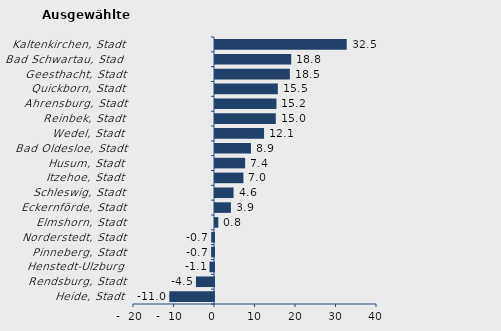
| Category | Wanderungssaldo |
|---|---|
| Heide, Stadt | -11.031 |
| Rendsburg, Stadt | -4.459 |
| Henstedt-Ulzburg | -1.107 |
| Pinneberg, Stadt | -0.713 |
| Norderstedt, Stadt | -0.695 |
| Elmshorn, Stadt | 0.821 |
| Eckernförde, Stadt | 3.928 |
| Schleswig, Stadt | 4.581 |
| Itzehoe, Stadt | 7.013 |
| Husum, Stadt | 7.441 |
| Bad Oldesloe, Stadt | 8.877 |
| Wedel, Stadt | 12.111 |
| Reinbek, Stadt | 15.009 |
| Ahrensburg, Stadt | 15.183 |
| Quickborn, Stadt | 15.513 |
| Geesthacht, Stadt | 18.485 |
| Bad Schwartau, Stadt | 18.824 |
| Kaltenkirchen, Stadt | 32.522 |